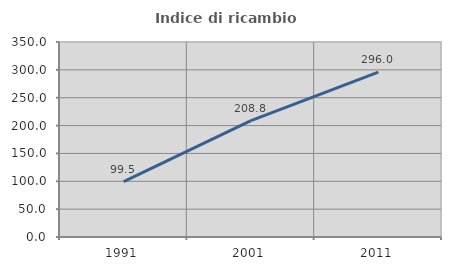
| Category | Indice di ricambio occupazionale  |
|---|---|
| 1991.0 | 99.471 |
| 2001.0 | 208.779 |
| 2011.0 | 296.047 |